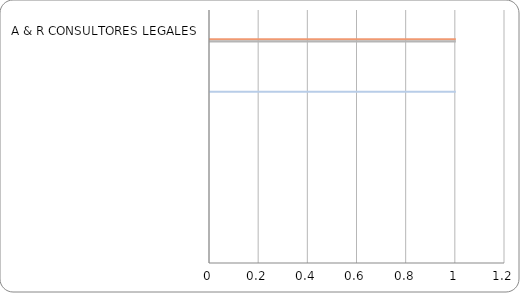
| Category | Series 0 | Series 1 | Series 2 | Series 3 | Series 4 | Series 5 | Series 6 | Series 7 | Series 8 | Series 9 | Series 10 | Series 11 | Series 12 | Series 13 | Series 14 | Series 15 | Series 16 | Series 17 | Series 18 |
|---|---|---|---|---|---|---|---|---|---|---|---|---|---|---|---|---|---|---|---|
| A & R CONSULTORES LEGALES | 0 | 0 | 0 | 0 | 0 | 0 | 0 | 0 | 0 | 0 | 0 | 0 | 0 | 1 | 1 | 0 | 0 | 0 | 0 |